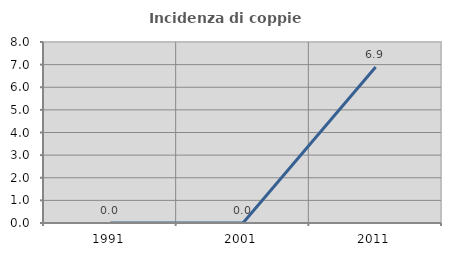
| Category | Incidenza di coppie miste |
|---|---|
| 1991.0 | 0 |
| 2001.0 | 0 |
| 2011.0 | 6.897 |